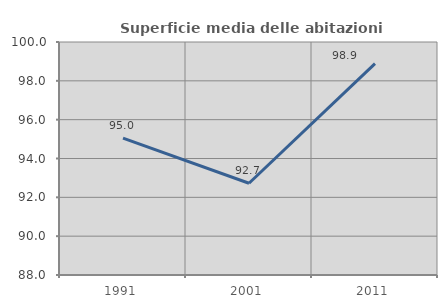
| Category | Superficie media delle abitazioni occupate |
|---|---|
| 1991.0 | 95.048 |
| 2001.0 | 92.727 |
| 2011.0 | 98.888 |